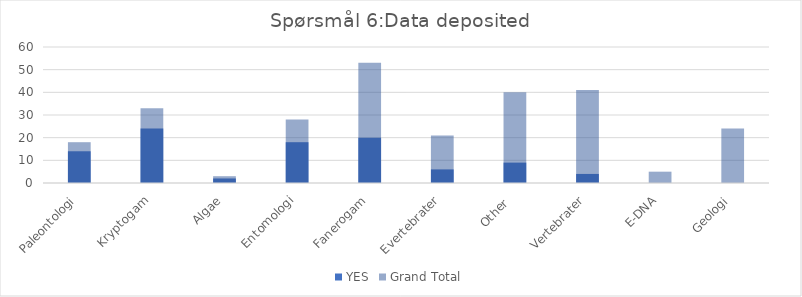
| Category | YES | Grand Total |
|---|---|---|
| Paleontologi | 14 | 18 |
| Kryptogam | 24 | 33 |
| Algae | 2 | 3 |
| Entomologi | 18 | 28 |
| Fanerogam | 20 | 53 |
| Evertebrater | 6 | 21 |
| Other  | 9 | 40 |
| Vertebrater | 4 | 41 |
| E-DNA | 0 | 5 |
| Geologi | 0 | 24 |